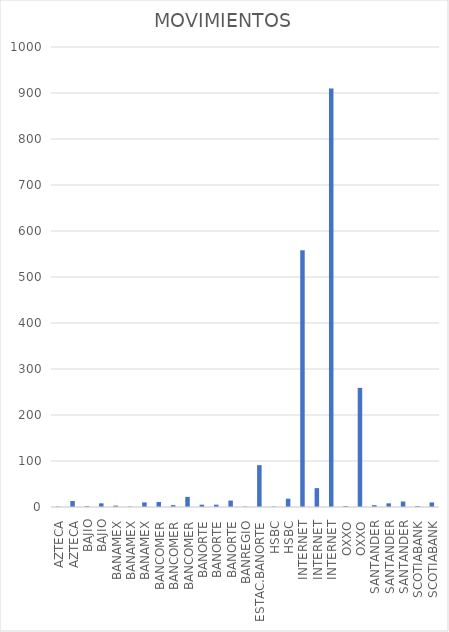
| Category | MOVIMIENTOS |
|---|---|
| AZTECA | 1 |
| AZTECA | 13 |
| BAJIO | 2 |
| BAJIO | 8 |
| BANAMEX | 3 |
| BANAMEX | 1 |
| BANAMEX | 10 |
| BANCOMER | 11 |
| BANCOMER | 4 |
| BANCOMER | 22 |
| BANORTE | 5 |
| BANORTE | 5 |
| BANORTE | 14 |
| BANREGIO | 1 |
| ESTAC.BANORTE | 91 |
| HSBC | 1 |
| HSBC | 18 |
| INTERNET | 558 |
| INTERNET | 41 |
| INTERNET | 910 |
| OXXO | 2 |
| OXXO | 259 |
| SANTANDER | 4 |
| SANTANDER | 8 |
| SANTANDER | 12 |
| SCOTIABANK | 2 |
| SCOTIABANK | 10 |